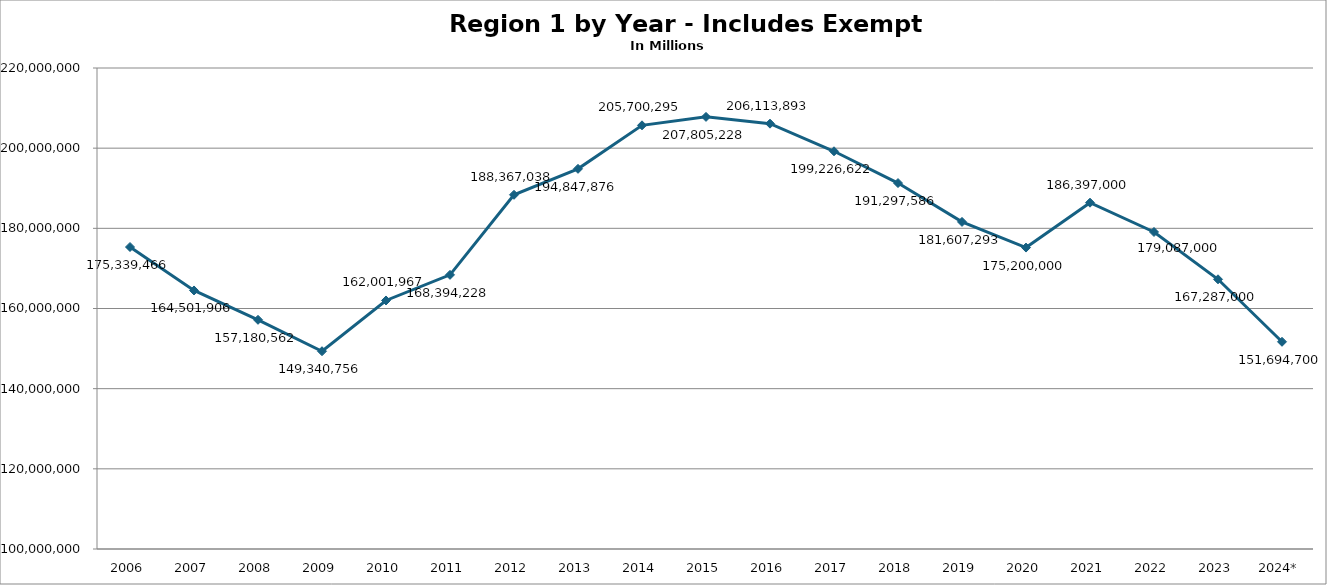
| Category | Series 0 |
|---|---|
| 2006 | 175339466.183 |
| 2007 | 164501906 |
| 2008 | 157180562 |
| 2009 | 149340756 |
| 2010 | 162001967.25 |
| 2011 | 168394228 |
| 2012 | 188367038 |
| 2013 | 194847876 |
| 2014 | 205700295 |
| 2015 | 207805228 |
| 2016 | 206113893 |
| 2017 | 199226622 |
| 2018 | 191297586 |
| 2019 | 181607293 |
| 2020 | 175200000 |
| 2021 | 186397000 |
| 2022 | 179087000 |
| 2023 | 167287000 |
| 2024* | 151694700 |